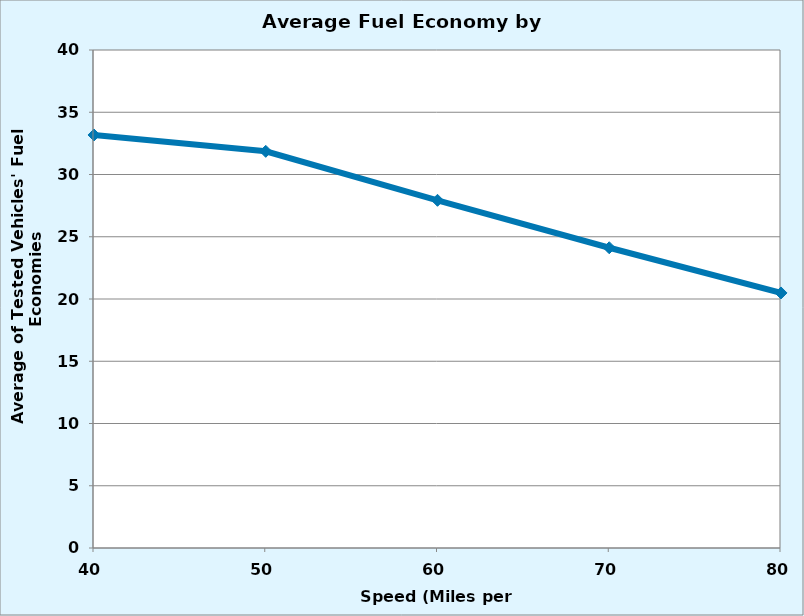
| Category | Series 1 |
|---|---|
| 40.0 | 33.175 |
| 50.0 | 31.861 |
| 60.0 | 27.927 |
| 70.0 | 24.116 |
| 80.0 | 20.486 |